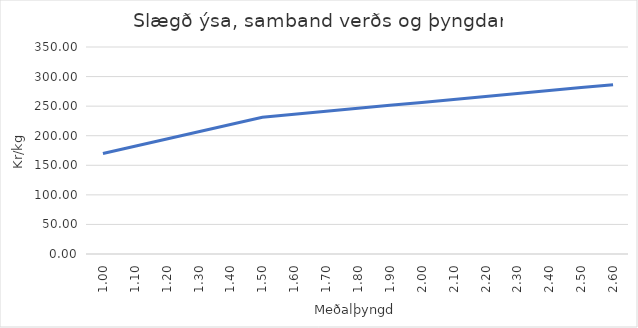
| Category | 156.60 |
|---|---|
| 1.0 | 169.864 |
| 1.1 | 182.157 |
| 1.2 | 194.451 |
| 1.3 | 206.744 |
| 1.4 | 219.038 |
| 1.5 | 231.331 |
| 1.6 | 236.331 |
| 1.7 | 241.33 |
| 1.8 | 246.329 |
| 1.9 | 251.329 |
| 2.0 | 256.328 |
| 2.1 | 261.327 |
| 2.2 | 266.327 |
| 2.3 | 271.326 |
| 2.4 | 276.325 |
| 2.5 | 281.325 |
| 2.6 | 286.324 |